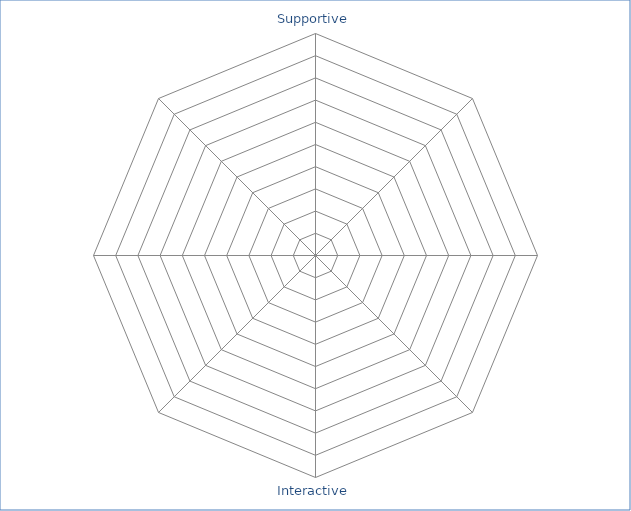
| Category | Course |
|---|---|
| Supportive | 0 |
| Interactive | 0 |
| Active | 0 |
| Contextual | 0 |
| Innovative | 0 |
| Flexible | 0 |
| Diverse | 0 |
| Inclusive | 0 |